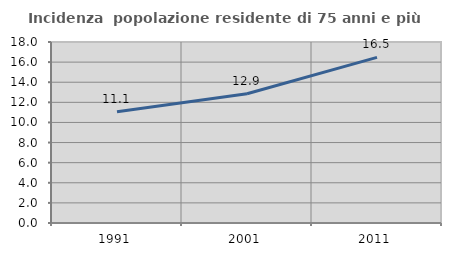
| Category | Incidenza  popolazione residente di 75 anni e più |
|---|---|
| 1991.0 | 11.065 |
| 2001.0 | 12.857 |
| 2011.0 | 16.471 |